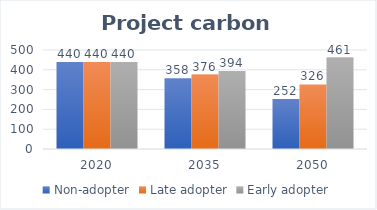
| Category | Non-adopter | Late adopter | Early adopter |
|---|---|---|---|
| 2020.0 | 440 | 440 | 440 |
| 2035.0 | 357.925 | 375.95 | 393.975 |
| 2050.0 | 251.964 | 326.227 | 461.492 |